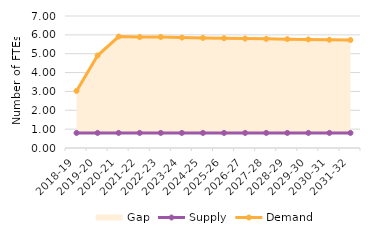
| Category | Supply | Demand |
|---|---|---|
| 2018-19 | 0.8 | 3.028 |
| 2019-20 | 0.8 | 4.905 |
| 2020-21 | 0.8 | 5.91 |
| 2021-22 | 0.8 | 5.882 |
| 2022-23 | 0.8 | 5.887 |
| 2023-24 | 0.8 | 5.854 |
| 2024-25 | 0.8 | 5.837 |
| 2025-26 | 0.8 | 5.82 |
| 2026-27 | 0.8 | 5.804 |
| 2027-28 | 0.8 | 5.788 |
| 2028-29 | 0.8 | 5.772 |
| 2029-30 | 0.8 | 5.756 |
| 2030-31 | 0.8 | 5.741 |
| 2031-32 | 0.8 | 5.726 |